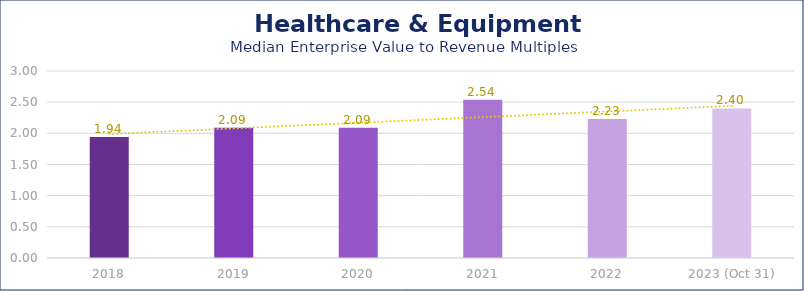
| Category | Healthcare & Equipment |
|---|---|
| 2018 | 1.94 |
| 2019 | 2.09 |
| 2020 | 2.09 |
| 2021 | 2.54 |
| 2022 | 2.23 |
| 2023 (Oct 31) | 2.4 |